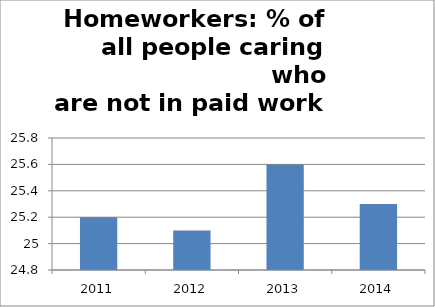
| Category | Homemaker |
|---|---|
| 2011.0 | 25.2 |
| 2012.0 | 25.1 |
| 2013.0 | 25.6 |
| 2014.0 | 25.3 |